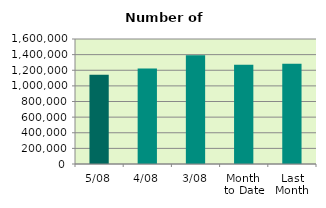
| Category | Series 0 |
|---|---|
| 5/08 | 1141474 |
| 4/08 | 1222906 |
| 3/08 | 1392568 |
| Month 
to Date | 1271687 |
| Last
Month | 1281605.545 |